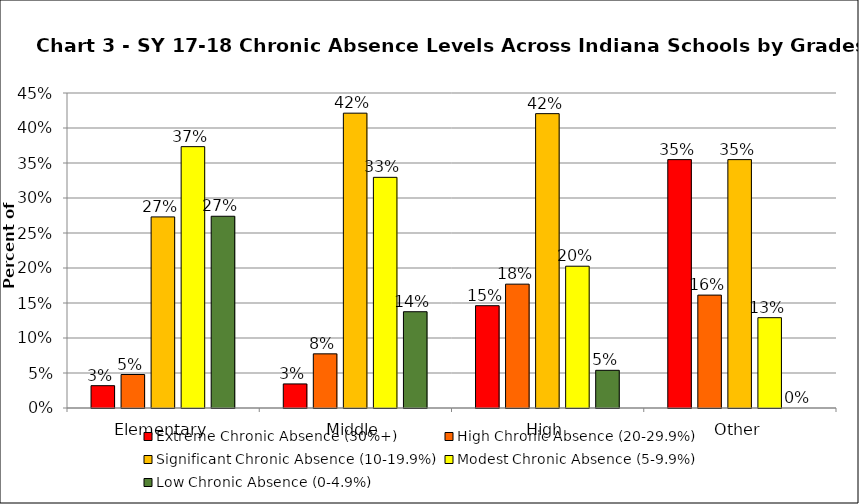
| Category | Extreme Chronic Absence (30%+) | High Chronic Absence (20-29.9%) | Significant Chronic Absence (10-19.9%) | Modest Chronic Absence (5-9.9%) | Low Chronic Absence (0-4.9%) |
|---|---|---|---|---|---|
| 0 | 0.032 | 0.048 | 0.273 | 0.373 | 0.274 |
| 1 | 0.034 | 0.077 | 0.421 | 0.33 | 0.138 |
| 2 | 0.146 | 0.177 | 0.421 | 0.203 | 0.054 |
| 3 | 0.355 | 0.161 | 0.355 | 0.129 | 0 |